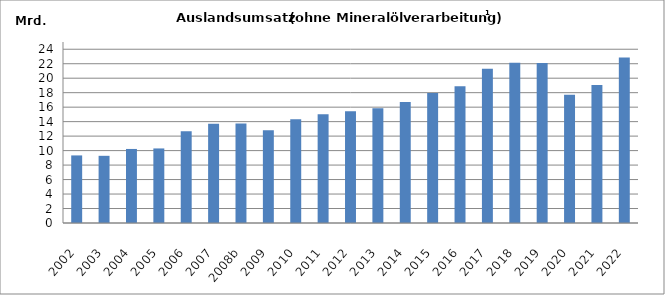
| Category | Series 0 |
|---|---|
| 2002  | 9333876.194 |
| 2003 | 9280061.294 |
| 2004 | 10227412.62 |
| 2005 | 10298460.421 |
| 2006  | 12658471.838 |
| 2007 | 13722597.678 |
| 2008b | 13747366.687 |
| 2009 | 12808832.69 |
| 2010  | 14321679.718 |
| 2011 | 15018937.533 |
| 2012  | 15435287.933 |
| 2013  | 15854090.158 |
| 2014  | 16718170.123 |
| 2015  | 17944142.383 |
| 2016  | 18894048.431 |
| 2017  | 21311172.808 |
| 2018  | 22141164.77 |
| 2019  | 22114399.679 |
| 2020  | 17704809.081 |
| 2021  | 19072263.273 |
| 2022  | 22849763.907 |